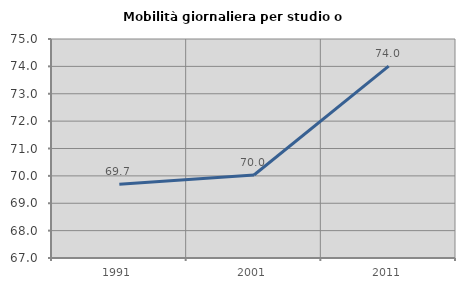
| Category | Mobilità giornaliera per studio o lavoro |
|---|---|
| 1991.0 | 69.694 |
| 2001.0 | 70.033 |
| 2011.0 | 74.009 |